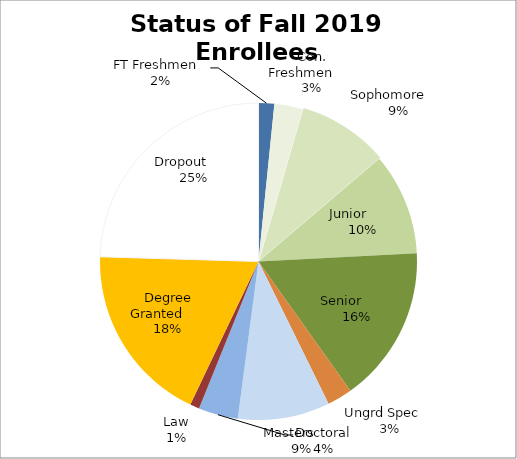
| Category | Series 0 |
|---|---|
| FT Freshmen   | 351 |
| Con. Freshmen      | 636 |
| Sophomore      | 2034 |
| Junior        | 2279 |
| Senior        | 3502 |
| Ungrd Spec    | 559 |
| Masters       | 2056 |
| Doctoral | 884 |
| Law | 209 |
| Degree Granted      | 4031 |
| Dropout       | 5376 |